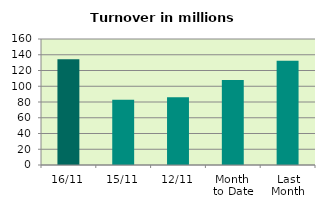
| Category | Series 0 |
|---|---|
| 16/11 | 134.297 |
| 15/11 | 82.863 |
| 12/11 | 86.022 |
| Month 
to Date | 107.818 |
| Last
Month | 132.268 |